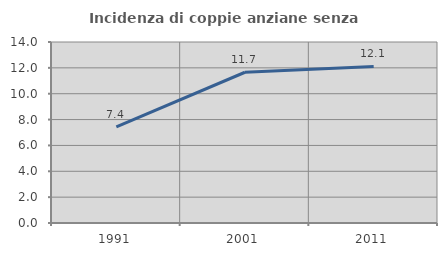
| Category | Incidenza di coppie anziane senza figli  |
|---|---|
| 1991.0 | 7.43 |
| 2001.0 | 11.66 |
| 2011.0 | 12.109 |